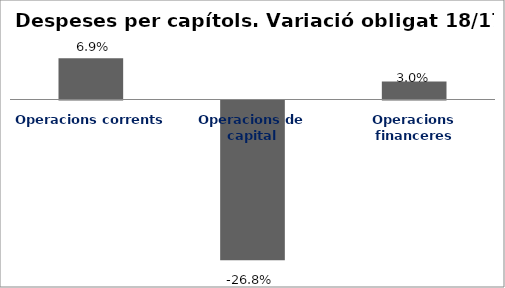
| Category | Series 0 |
|---|---|
| Operacions corrents | 0.069 |
| Operacions de capital | -0.268 |
| Operacions financeres | 0.03 |